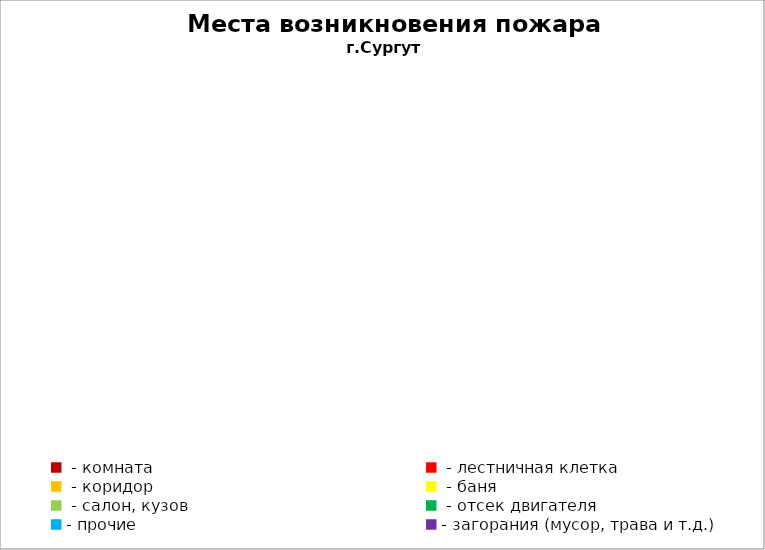
| Category | Места возникновения пожара |
|---|---|
|  - комната | 7 |
|  - лестничная клетка | 0 |
|  - коридор | 0 |
|  - баня | 0 |
|  - салон, кузов | 1 |
|  - отсек двигателя | 1 |
| - прочие | 6 |
| - загорания (мусор, трава и т.д.)  | 5 |